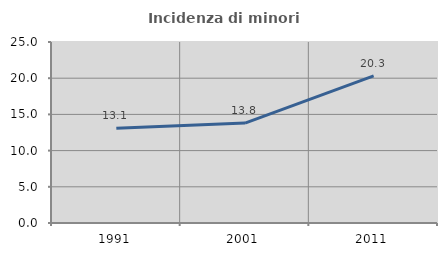
| Category | Incidenza di minori stranieri |
|---|---|
| 1991.0 | 13.077 |
| 2001.0 | 13.804 |
| 2011.0 | 20.322 |